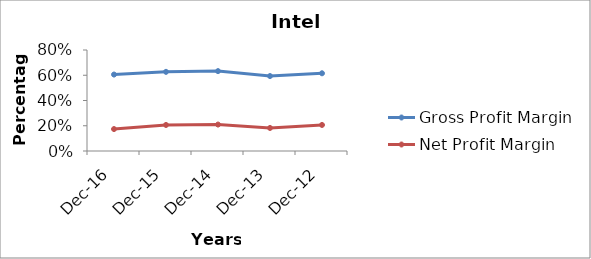
| Category | Gross Profit Margin | Net Profit Margin |
|---|---|---|
| 2016-12-31 | 0.606 | 0.174 |
| 2015-12-31 | 0.627 | 0.206 |
| 2014-12-31 | 0.633 | 0.209 |
| 2013-12-31 | 0.594 | 0.183 |
| 2012-12-31 | 0.616 | 0.206 |